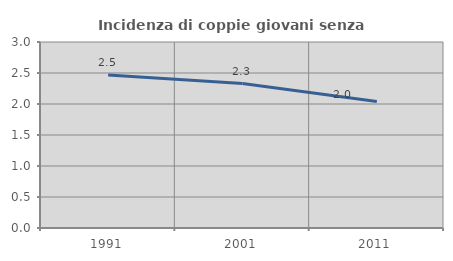
| Category | Incidenza di coppie giovani senza figli |
|---|---|
| 1991.0 | 2.469 |
| 2001.0 | 2.331 |
| 2011.0 | 2.041 |